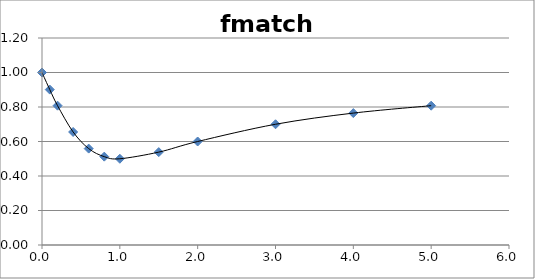
| Category | Series 0 |
|---|---|
| 0.0 | 1 |
| 0.1 | 0.901 |
| 0.2 | 0.808 |
| 0.4 | 0.655 |
| 0.6 | 0.559 |
| 0.8 | 0.512 |
| 1.0 | 0.5 |
| 1.5 | 0.538 |
| 2.0 | 0.6 |
| 3.0 | 0.7 |
| 4.0 | 0.765 |
| 5.0 | 0.808 |